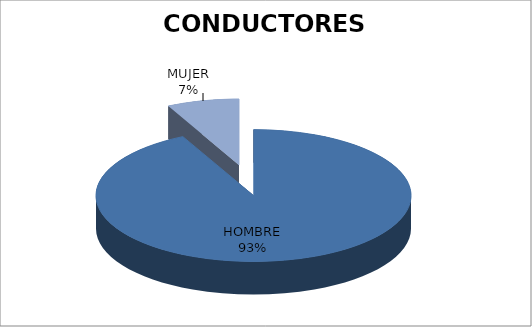
| Category | E.E. |
|---|---|
| HOMBRE | 25 |
| MUJER | 2 |